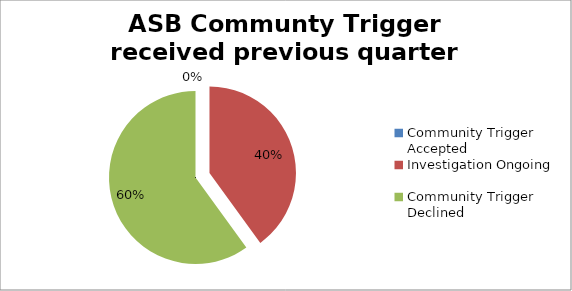
| Category | Series 0 |
|---|---|
| Community Trigger Accepted | 0 |
| Investigation Ongoing | 2 |
| Community Trigger Declined | 3 |